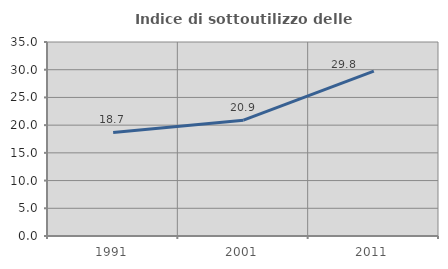
| Category | Indice di sottoutilizzo delle abitazioni  |
|---|---|
| 1991.0 | 18.681 |
| 2001.0 | 20.904 |
| 2011.0 | 29.762 |